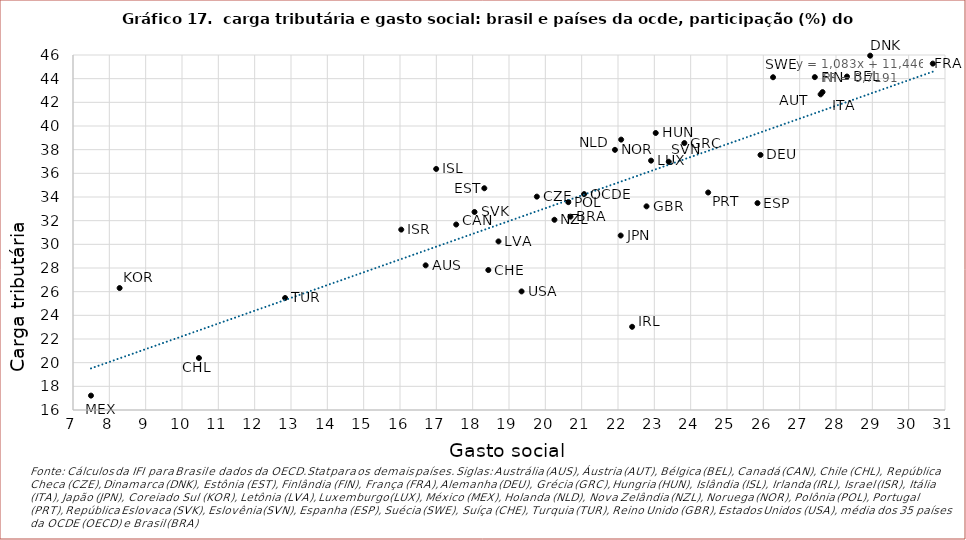
| Category | Carga tributária |
|---|---|
| 16.706 | 28.224 |
| 27.577 | 42.675 |
| 28.302 | 44.179 |
| 17.547 | 31.675 |
| 10.466 | 20.391 |
| 19.766 | 34.031 |
| 28.941 | 45.942 |
| 18.321 | 34.739 |
| 27.417 | 44.131 |
| 30.664 | 45.272 |
| 25.922 | 37.555 |
| 23.826 | 38.56 |
| 23.038 | 39.41 |
| 16.996 | 36.371 |
| 22.389 | 23.031 |
| 16.035 | 31.245 |
| 27.629 | 42.866 |
| 22.074 | 30.743 |
| 8.283 | 26.307 |
| 18.711 | 30.246 |
| 22.91 | 37.072 |
| 7.495 | 17.216 |
| 22.087 | 38.849 |
| 20.251 | 32.075 |
| 21.916 | 37.984 |
| 20.632 | 33.563 |
| 24.482 | 34.38 |
| 18.051 | 32.735 |
| 23.397 | 36.979 |
| 25.839 | 33.483 |
| 26.268 | 44.12 |
| 18.431 | 27.826 |
| 12.838 | 25.465 |
| 22.785 | 33.21 |
| 19.346 | 26.021 |
| 21.0668 | 34.245 |
| 20.691228014780457 | 32.337 |